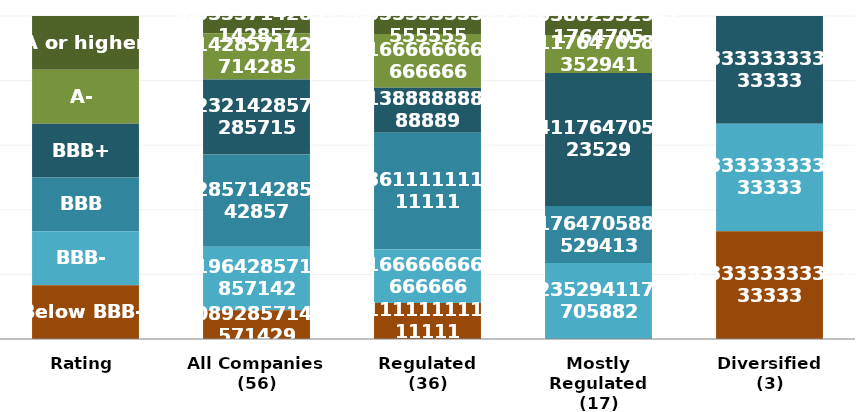
| Category | A or higher | A- | BBB+ | BBB | BBB- | Below BBB- |
|---|---|---|---|---|---|---|
| Rating | 1 | 1 | 1 | 1 | 1 | 1 |
| All Companies
(56) | 3 | 8 | 13 | 16 | 11 | 5 |
| Regulated
(36) | 2 | 6 | 5 | 13 | 6 | 4 |
| Mostly Regulated
(17) | 1 | 2 | 7 | 3 | 4 | 0 |
| Diversified
(3) | 0 | 0 | 1 | 0 | 1 | 1 |